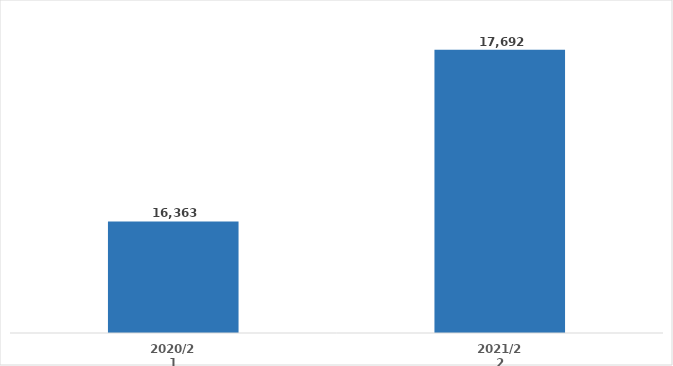
| Category | Total Clients |
|---|---|
| 2020/21 | 16363.05 |
| 2021/22 | 17692 |